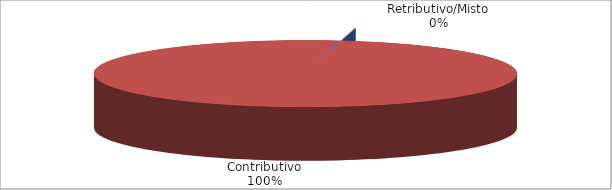
| Category | Series 1 |
|---|---|
| Retributivo/Misto | 0 |
| Contributivo | 34233 |